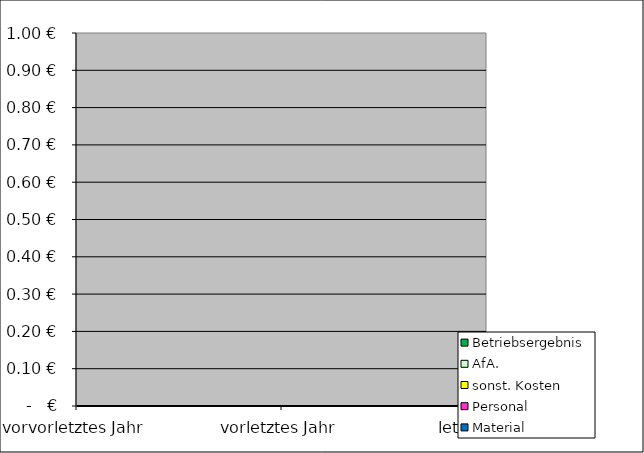
| Category | Material | Personal | sonst. Kosten | AfA. | Betriebsergebnis |
|---|---|---|---|---|---|
| vorvorletztes Jahr | 0 | 0 | 0 | 0 | 0 |
| vorletztes Jahr | 0 | 0 | 0 | 0 | 0 |
| letztes Jahr | 0 | 0 | 0 | 0 | 0 |